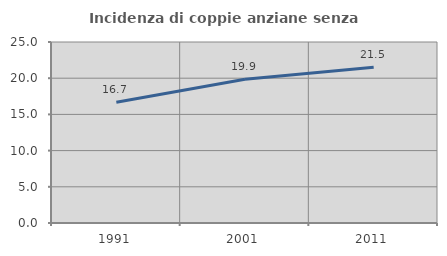
| Category | Incidenza di coppie anziane senza figli  |
|---|---|
| 1991.0 | 16.667 |
| 2001.0 | 19.86 |
| 2011.0 | 21.517 |